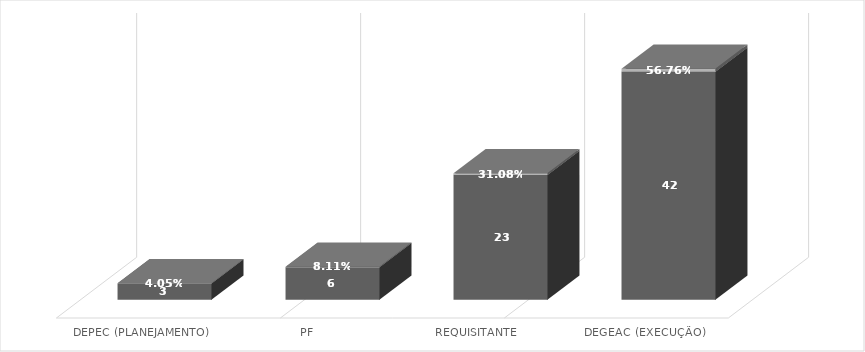
| Category | Contagem de Processo nº | Contagem de Processo nº2 |
|---|---|---|
| DEPEC (PLANEJAMENTO) | 3 | 0.041 |
| PF | 6 | 0.081 |
| REQUISITANTE | 23 | 0.311 |
| DEGEAC (EXECUÇÃO) | 42 | 0.568 |